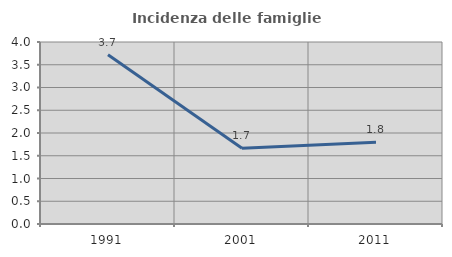
| Category | Incidenza delle famiglie numerose |
|---|---|
| 1991.0 | 3.721 |
| 2001.0 | 1.665 |
| 2011.0 | 1.798 |